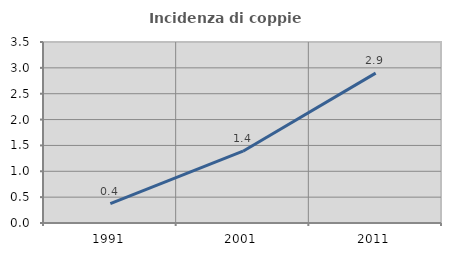
| Category | Incidenza di coppie miste |
|---|---|
| 1991.0 | 0.375 |
| 2001.0 | 1.389 |
| 2011.0 | 2.899 |